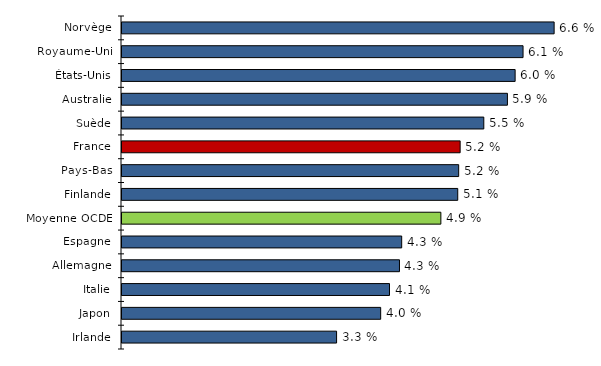
| Category | Series 0 |
|---|---|
| Irlande | 3.287 |
| Japon | 3.962 |
| Italie | 4.098 |
| Allemagne | 4.25 |
| Espagne | 4.284 |
| Moyenne OCDE | 4.884 |
| Finlande | 5.143 |
| Pays-Bas | 5.157 |
| France | 5.179 |
| Suède | 5.542 |
| Australie | 5.904 |
| États-Unis | 6.022 |
| Royaume-Uni | 6.143 |
| Norvège | 6.619 |